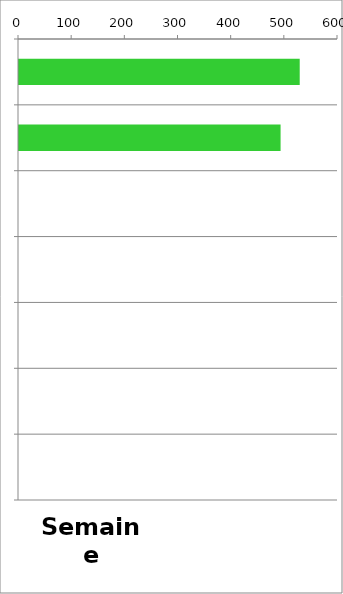
| Category | TV |
|---|---|
| 0 | 528 |
| 1 | 492 |
| 2 | 0 |
| 3 | 0 |
| 4 | 0 |
| 5 | 0 |
| 6 | 0 |